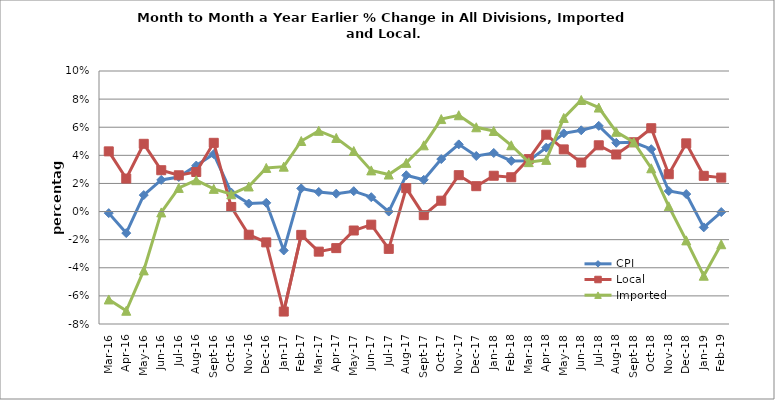
| Category | CPI | Local | Imported |
|---|---|---|---|
| 2016-03-01 | -0.001 | 0.043 | -0.063 |
| 2016-04-01 | -0.015 | 0.023 | -0.071 |
| 2016-05-01 | 0.012 | 0.048 | -0.042 |
| 2016-06-01 | 0.023 | 0.029 | -0.001 |
| 2016-07-01 | 0.025 | 0.026 | 0.017 |
| 2016-08-01 | 0.033 | 0.028 | 0.022 |
| 2016-09-01 | 0.041 | 0.049 | 0.016 |
| 2016-10-01 | 0.014 | 0.003 | 0.012 |
| 2016-11-01 | 0.006 | -0.016 | 0.018 |
| 2016-12-01 | 0.006 | -0.022 | 0.031 |
| 2017-01-01 | -0.028 | -0.071 | 0.032 |
| 2017-02-01 | 0.016 | -0.017 | 0.05 |
| 2017-03-01 | 0.014 | -0.029 | 0.057 |
| 2017-04-01 | 0.013 | -0.026 | 0.052 |
| 2017-05-01 | 0.015 | -0.013 | 0.043 |
| 2017-06-01 | 0.01 | -0.009 | 0.029 |
| 2017-07-01 | 0 | -0.027 | 0.026 |
| 2017-08-01 | 0.026 | 0.017 | 0.035 |
| 2017-09-01 | 0.023 | -0.003 | 0.047 |
| 2017-10-01 | 0.037 | 0.008 | 0.066 |
| 2017-11-01 | 0.048 | 0.026 | 0.069 |
| 2017-12-01 | 0.04 | 0.018 | 0.06 |
| 2018-01-01 | 0.042 | 0.025 | 0.057 |
| 2018-02-01 | 0.036 | 0.024 | 0.047 |
| 2018-03-01 | 0.036 | 0.037 | 0.035 |
| 2018-04-01 | 0.045 | 0.055 | 0.037 |
| 2018-05-01 | 0.056 | 0.044 | 0.067 |
| 2018-06-01 | 0.058 | 0.035 | 0.079 |
| 2018-07-01 | 0.061 | 0.047 | 0.074 |
| 2018-08-01 | 0.049 | 0.041 | 0.057 |
| 2018-09-01 | 0.049 | 0.049 | 0.049 |
| 2018-10-01 | 0.044 | 0.059 | 0.031 |
| 2018-11-01 | 0.015 | 0.027 | 0.004 |
| 2018-12-01 | 0.012 | 0.049 | -0.021 |
| 2019-01-01 | -0.011 | 0.025 | -0.046 |
| 2019-02-01 | 0 | 0.024 | -0.023 |